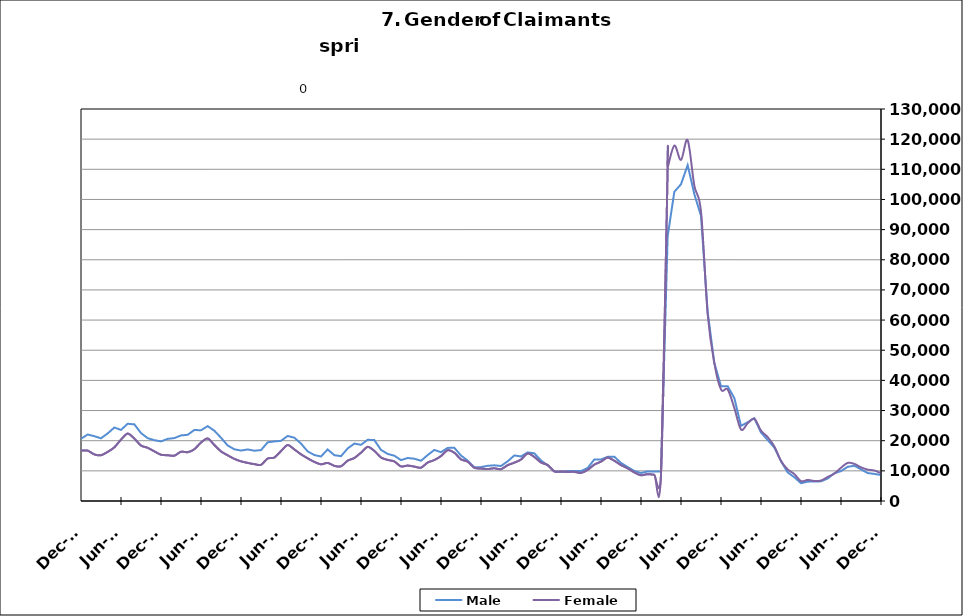
| Category | Male | Female |
|---|---|---|
| 1995-02-28 | 11910 | 7689 |
| 1995-03-31 | 12528 | 7887 |
| 1995-04-30 | 14119 | 8295 |
| 1995-05-31 | 15153 | 8659 |
| 1995-06-30 | 14654 | 9963 |
| 1995-07-31 | 16478 | 11435 |
| 1995-08-31 | 16264 | 11011 |
| 1995-09-30 | 13352 | 9104 |
| 1995-10-31 | 11499 | 8670 |
| 1995-11-30 | 10418 | 7960 |
| 1995-12-31 | 11010 | 7787 |
| 1996-01-31 | 11539 | 7863 |
| 1996-02-29 | 12768 | 7894 |
| 1996-03-31 | 13246 | 7755 |
| 1996-04-30 | 16021 | 8296 |
| 1996-05-31 | 15929 | 8751 |
| 1996-06-30 | 15291 | 10224 |
| 1996-07-31 | 17229 | 11535 |
| 1996-08-31 | 16317 | 10611 |
| 1996-09-30 | 13793 | 8812 |
| 1996-10-31 | 11431 | 8215 |
| 1996-11-30 | 10510 | 7751 |
| 1996-12-31 | 10023 | 7185 |
| 1997-01-31 | 12006 | 7404 |
| 1997-02-28 | 11976 | 7384 |
| 1997-03-31 | 11924 | 7078 |
| 1997-04-30 | 13098 | 7454 |
| 1997-05-31 | 13763 | 8032 |
| 1997-06-30 | 12872 | 9377 |
| 1997-07-31 | 15358 | 10550 |
| 1997-08-31 | 14888 | 9776 |
| 1997-09-30 | 12307 | 8016 |
| 1997-10-31 | 10749.5 | 7444 |
| 1997-11-30 | 9192 | 6872 |
| 1997-12-31 | 8541 | 6180 |
| 1998-01-31 | 9230 | 6563 |
| 1998-02-28 | 9286 | 6048 |
| 1998-03-31 | 9805 | 6012 |
| 1998-04-30 | 12254 | 7080 |
| 1998-05-31 | 13029 | 7509 |
| 1998-06-30 | 12376 | 9201 |
| 1998-07-31 | 14264 | 10448 |
| 1998-08-31 | 14319 | 9908 |
| 1998-09-30 | 12515 | 8202 |
| 1998-10-31 | 9927 | 7502 |
| 1998-11-30 | 9481 | 7563 |
| 1998-12-31 | 9422 | 7289 |
| 1999-01-31 | 10826 | 7829 |
| 1999-02-28 | 10614 | 7417 |
| 1999-03-31 | 10596 | 7180 |
| 1999-04-30 | 14139 | 8377 |
| 1999-05-31 | 14748 | 8508 |
| 1999-06-30 | 13399 | 9753 |
| 1999-07-31 | 16831 | 11294 |
| 1999-08-31 | 17466 | 10502 |
| 1999-09-30 | 14075 | 8356 |
| 1999-10-31 | 11344 | 7743 |
| 1999-11-30 | 10401 | 7623 |
| 1999-12-31 | 9702 | 6793 |
| 2000-01-31 | 10263 | 7252 |
| 2000-02-29 | 10217 | 7054 |
| 2000-03-31 | 10848 | 6860 |
| 2000-04-30 | 13099 | 8062 |
| 2000-05-31 | 13692 | 8388 |
| 2000-06-30 | 13498 | 10306 |
| 2000-07-31 | 15682 | 11874 |
| 2000-08-31 | 15407 | 10967 |
| 2000-09-30 | 12230 | 8808 |
| 2000-10-31 | 10182 | 8230 |
| 2000-11-30 | 9376 | 8049 |
| 2000-12-31 | 9229 | 7777 |
| 2001-01-31 | 10264 | 8400 |
| 2001-02-28 | 11709 | 8801 |
| 2001-03-31 | 9919 | 7036 |
| 2001-04-30 | 17255 | 11559 |
| 2001-05-31 | 18656 | 12219 |
| 2001-06-30 | 19590 | 15536 |
| 2001-07-31 | 22235 | 17388 |
| 2001-08-31 | 22550 | 16255 |
| 2001-09-30 | 20719 | 15193 |
| 2001-10-31 | 20761 | 15705 |
| 2001-11-30 | 22570 | 16084 |
| 2001-12-31 | 24429 | 16497 |
| 2002-01-31 | 26188 | 17125 |
| 2002-02-28 | 27071 | 16705 |
| 2002-03-31 | 26691 | 16475 |
| 2002-04-30 | 32125 | 20940 |
| 2002-05-31 | 31589 | 20115 |
| 2002-06-30 | 30220 | 21952 |
| 2002-07-31 | 30981 | 23132 |
| 2002-08-31 | 23858 | 16993 |
| 2002-09-30 | 27757 | 19832 |
| 2002-10-31 | 25023 | 18451 |
| 2002-11-30 | 24331 | 17763 |
| 2002-12-31 | 24361 | 17175 |
| 2003-01-31 | 24361 | 17175 |
| 2003-02-28 | 26133 | 17155 |
| 2003-03-31 | 26934 | 17491 |
| 2003-04-30 | 29393 | 19122 |
| 2003-05-31 | 30480 | 19811 |
| 2003-06-30 | 30177 | 22643 |
| 2003-07-31 | 30615 | 23565 |
| 2003-08-31 | 29860 | 22195 |
| 2003-09-30 | 26777 | 19925 |
| 2003-10-31 | 23899 | 18782 |
| 2003-11-30 | 22247 | 17944 |
| 2003-12-31 | 20902 | 16829 |
| 2004-01-31 | 20479 | 15794 |
| 2004-02-29 | 18869 | 14174 |
| 2004-03-31 | 18157 | 13452 |
| 2004-04-30 | 20525 | 14655 |
| 2004-05-31 | 20588 | 14975 |
| 2004-06-30 | 20148 | 17494 |
| 2004-07-31 | 22098 | 19064 |
| 2004-08-31 | 20778 | 16925 |
| 2004-09-30 | 17457 | 14258 |
| 2004-10-31 | 15548 | 13549 |
| 2004-11-30 | 14919 | 12836 |
| 2004-12-31 | 14200 | 11711 |
| 2005-01-31 | 14968 | 11918 |
| 2005-02-28 | 14478 | 11045 |
| 2005-03-31 | 13958 | 10426 |
| 2005-04-30 | 15898 | 11682 |
| 2005-05-31 | 16188 | 11900 |
| 2005-06-30 | 15549 | 14256 |
| 2005-07-31 | 16728 | 15274 |
| 2005-08-31 | 16418 | 13314 |
| 2005-09-30 | 12729 | 10857 |
| 2005-10-31 | 11493 | 10421 |
| 2005-11-30 | 10480 | 9638 |
| 2005-12-31 | 9482 | 8742 |
| 2006-01-31 | 9638 | 8761 |
| 2006-02-28 | 8844 | 7847 |
| 2006-03-31 | 9353 | 7709 |
| 2006-04-30 | 11916 | 9300 |
| 2006-05-31 | 12755 | 10017 |
| 2006-06-30 | 12840 | 12614 |
| 2006-07-31 | 14534 | 14007 |
| 2006-08-31 | 14510 | 12902 |
| 2006-09-30 | 12359 | 10850 |
| 2006-10-31 | 11360 | 10309 |
| 2006-11-30 | 10702 | 9403 |
| 2006-12-31 | 10886 | 9298 |
| 2007-01-31 | 11619 | 9539 |
| 2007-02-28 | 12137 | 9112 |
| 2007-03-31 | 12434 | 9125 |
| 2007-04-30 | 14864 | 10520 |
| 2007-05-31 | 16656 | 11730 |
| 2007-06-30 | 16711 | 14024 |
| 2007-07-31 | 18458 | 15882 |
| 2007-08-31 | 17879 | 14187 |
| 2007-09-30 | 16538 | 13586 |
| 2007-10-31 | 15458 | 13070 |
| 2007-11-15 | 14626 | 12172 |
| 2007-12-15 09:36:00 | 15625 | 12363 |
| 2008-01-14 19:12:00 | 17236 | 12936 |
| 2008-02-14 04:48:00 | 18262 | 12696 |
| 2008-03-15 14:24:00 | 19119 | 13263 |
| 2008-04-15 | 22039 | 15054 |
| 2008-05-15 09:36:00 | 24402 | 16733 |
| 2008-06-14 19:12:00 | 25155 | 19969 |
| 2008-07-15 04:48:00 | 27499 | 22268 |
| 2008-08-14 14:24:00 | 29286 | 21514 |
| 2008-09-14 | 30571 | 21776 |
| 2008-10-14 09:36:00 | 32282 | 22190 |
| 2008-11-13 19:12:00 | 36325 | 23395 |
| 2008-12-14 04:48:00 | 42012 | 25046 |
| 2009-01-13 14:24:00 | 49131 | 27148 |
| 2009-02-13 | 56509 | 29774 |
| 2009-03-15 09:36:00 | 63334 | 33788 |
| 2009-04-14 19:12:00 | 69062 | 36842 |
| 2009-05-15 04:48:00 | 69914 | 37773 |
| 2009-06-14 14:24:00 | 69512 | 42787 |
| 2009-07-15 | 71226 | 46347 |
| 2009-08-14 09:36:00 | 68777 | 43130 |
| 2009-09-13 19:12:00 | 65993 | 41526 |
| 2009-10-14 04:48:00 | 62480 | 40217 |
| 2009-11-13 14:24:00 | 60354 | 38454 |
| 2009-12-14 | 59507 | 36101 |
| 2010-01-13 09:36:00 | 58501 | 35014 |
| 2010-02-12 19:12:00 | 55590 | 32911 |
| 2010-03-15 04:48:00 | 53238 | 31883 |
| 2010-04-14 14:24:00 | 52264 | 32995 |
| 2010-05-15 | 50301 | 32394 |
| 2010-06-14 09:36:00 | 48130 | 36605 |
| 2010-07-14 19:12:00 | 48060 | 38748 |
| 2010-08-14 04:48:00 | 46311 | 35599 |
| 2010-09-13 14:24:00 | 41641 | 32453 |
| 2010-10-14 | 40403 | 32335 |
| 2010-11-13 09:36:00 | 38250 | 30275 |
| 2010-12-13 19:12:00 | 35858 | 26887 |
| 2011-01-13 04:48:00 | 37777 | 27522 |
| 2011-02-12 14:24:00 | 37515 | 26470 |
| 2011-03-15 | 35802 | 25248 |
| 2011-04-14 09:36:00 | 37452 | 26608 |
| 2011-05-14 19:12:00 | 37975 | 27212 |
| 2011-06-14 04:48:00 | 42289 | 36578 |
| 2011-07-14 14:24:00 | 42307 | 37061 |
| 2011-08-14 | 38125 | 31317 |
| 2011-09-13 09:36:00 | 34564 | 28090 |
| 2011-10-13 19:12:00 | 33146 | 27591 |
| 2011-11-13 04:48:00 | 31337 | 25538 |
| 2011-12-13 14:24:00 | 30334 | 23349 |
| 2012-01-13 | 31566 | 23385 |
| 2012-02-12 09:36:00 | 30859 | 22326 |
| 2012-03-13 19:12:00 | 29261 | 21568 |
| 2012-04-13 04:48:00 | 31494 | 22964 |
| 2012-05-13 14:24:00 | 32509 | 24284 |
| 2012-06-13 | 30900 | 27768 |
| 2012-07-13 09:36:00 | 33549 | 29756 |
| 2012-08-12 19:12:00 | 28663 | 24059 |
| 2012-09-12 04:48:00 | 25271 | 21482 |
| 2012-10-12 14:24:00 | 22730 | 20363 |
| 2012-11-12 | 19953 | 17450 |
| 2012-12-12 09:36:00 | 20635 | 16737 |
| 2013-01-11 19:12:00 | 22057 | 16712 |
| 2013-02-11 04:48:00 | 21486 | 15451 |
| 2013-03-13 14:24:00 | 20791 | 15186 |
| 2013-04-13 | 22409 | 16286 |
| 2013-05-13 09:36:00 | 24366 | 17794 |
| 2013-06-12 19:12:00 | 23573 | 20360 |
| 2013-07-13 04:48:00 | 25613 | 22369 |
| 2013-08-12 14:24:00 | 25420 | 20697 |
| 2013-09-12 | 22525 | 18385 |
| 2013-10-12 09:36:00 | 20848 | 17632 |
| 2013-11-11 19:12:00 | 20174 | 16466 |
| 2013-12-12 04:48:00 | 19765 | 15343 |
| 2014-01-11 14:24:00 | 20604 | 15183 |
| 2014-02-11 | 20864 | 15026 |
| 2014-03-13 09:36:00 | 21751 | 16343 |
| 2014-04-12 19:12:00 | 21948 | 16190 |
| 2014-05-13 04:48:00 | 23554 | 17163 |
| 2014-06-12 14:24:00 | 23446 | 19393 |
| 2014-07-13 | 24827 | 20751 |
| 2014-08-14 | 23315 | 18575 |
| 2014-09-13 09:36:00 | 20988 | 16453 |
| 2014-10-13 19:12:00 | 18411 | 15157 |
| 2014-11-13 04:48:00 | 17155 | 13975 |
| 2014-12-13 14:24:00 | 16727 | 13162 |
| 2015-01-13 | 17097 | 12633 |
| 2015-02-12 09:36:00 | 16674 | 12222 |
| 2015-03-14 19:12:00 | 16878 | 11988 |
| 2015-04-14 04:48:00 | 19448 | 14078 |
| 2015-05-14 14:24:00 | 19759 | 14413 |
| 2015-06-14 | 19952 | 16548 |
| 2015-07-14 09:36:00 | 21569 | 18572 |
| 2015-08-13 19:12:00 | 21001 | 17106 |
| 2015-09-13 04:48:00 | 19028 | 15475 |
| 2015-10-13 14:24:00 | 16459 | 14160 |
| 2015-11-13 | 15246 | 12968 |
| 2015-12-13 09:36:00 | 14756 | 12166 |
| 2016-01-12 19:12:00 | 17097 | 12633 |
| 2016-02-12 04:48:00 | 15198 | 11659 |
| 2016-03-13 14:24:00 | 14862 | 11506 |
| 2016-04-13 | 17432 | 13364 |
| 2016-05-13 09:36:00 | 19040 | 14264 |
| 2016-06-12 19:12:00 | 18628 | 16024 |
| 2016-07-13 04:48:00 | 20305 | 17959 |
| 2016-08-12 14:24:00 | 20204 | 16625 |
| 2016-09-12 | 16946 | 14443 |
| 2016-10-12 09:36:00 | 15612 | 13624 |
| 2016-11-11 19:12:00 | 15023 | 13122 |
| 2016-12-12 04:48:00 | 13560 | 11454 |
| 2017-01-11 14:24:00 | 14257 | 11754 |
| 2017-02-11 | 14028 | 11405 |
| 2017-03-13 09:36:00 | 13342 | 11038 |
| 2017-04-12 19:12:00 | 15225 | 12749 |
| 2017-05-13 04:48:00 | 16938 | 13582 |
| 2017-06-12 14:24:00 | 16188 | 14911 |
| 2017-07-13 | 17613 | 16845 |
| 2017-08-12 09:36:00 | 17640 | 16005 |
| 2017-09-11 19:12:00 | 15075 | 13806 |
| 2017-10-12 04:48:00 | 13384 | 13044 |
| 2017-11-11 14:24:00 | 11160 | 11015 |
| 2017-12-12 | 11238 | 10767 |
| 2018-01-11 09:36:00 | 11674 | 10594 |
| 2018-02-10 19:12:00 | 11835 | 10845 |
| 2018-03-13 04:48:00 | 11605 | 10548 |
| 2018-04-12 14:24:00 | 13162 | 11886 |
| 2018-05-13 | 15110 | 12712 |
| 2018-06-12 09:36:00 | 14782 | 13754 |
| 2018-07-12 19:12:00 | 16123 | 15773 |
| 2018-08-12 04:48:00 | 15808 | 14614 |
| 2018-09-11 14:24:00 | 13450 | 12761 |
| 2018-10-12 | 11831 | 11941 |
| 2018-11-11 09:36:00 | 9820 | 9821 |
| 2018-12-11 19:12:00 | 9649 | 9767 |
| 2019-01-11 04:48:00 | 9933 | 9654 |
| 2019-02-10 14:24:00 | 9925 | 9651 |
| 2019-03-13 | 9922 | 9318 |
| 2019-04-12 09:36:00 | 10950 | 10320 |
| 2019-05-12 19:12:00 | 13782 | 12072 |
| 2019-06-12 04:48:00 | 13767 | 13063 |
| 2019-07-12 14:24:00 | 14644 | 14409 |
| 2019-08-12 | 14678 | 13343 |
| 2019-09-11 09:36:00 | 12637 | 11915 |
| 2019-10-11 19:12:00 | 11254 | 10847 |
| 2019-11-11 04:48:00 | 9954 | 9467 |
| 2019-12-11 14:24:00 | 9289 | 8549 |
| 2020-01-11 | 9815 | 8911 |
| 2020-02-10 09:36:00 | 9754 | 8723 |
| 2020-03-11 19:12:00 | 9805 | 8802 |
| 2020-04-11 04:48:00 | 87837 | 110534 |
| 2020-05-11 14:24:00 | 102538 | 117856 |
| 2020-06-11 | 105039 | 113108 |
| 2020-07-11 09:36:00 | 111386 | 119644 |
| 2020-08-10 19:12:00 | 101758 | 104593 |
| 2020-09-10 04:48:00 | 94558 | 95979 |
| 2020-10-10 14:24:00 | 62680 | 62005 |
| 2020-11-10 | 45770 | 45707 |
| 2020-12-10 09:36:00 | 38071 | 36983 |
| 2021-01-09 19:12:00 | 38071 | 36983 |
| 2021-02-09 04:48:00 | 34126 | 30845 |
| 2021-03-11 14:24:00 | 24924 | 23717 |
| 2021-04-11 | 26116 | 25767 |
| 2021-05-11 09:36:00 | 27432 | 27279 |
| 2021-06-10 19:12:00 | 22711 | 23336 |
| 2021-07-11 04:48:00 | 20218 | 21201 |
| 2021-08-10 14:24:00 | 17708 | 18105 |
| 2021-09-10 | 13157 | 13319 |
| 2021-10-10 09:36:00 | 9494 | 10478 |
| 2021-11-09 19:12:00 | 7871 | 8942 |
| 2021-12-10 04:48:00 | 5889 | 6585 |
| 2022-01-09 14:24:00 | 6421 | 6988 |
| 2022-02-09 | 6439 | 6634 |
| 2022-03-11 09:36:00 | 6526 | 6780 |
| 2022-04-10 19:12:00 | 7456 | 7968 |
| 2022-05-11 04:48:00 | 9208 | 9103 |
| 2022-06-10 14:24:00 | 9908 | 11010 |
| 2022-07-11 | 11333 | 12637 |
| 2022-08-10 09:36:00 | 11684 | 12302 |
| 2022-09-09 19:12:00 | 10505 | 11164 |
| 2022-10-10 04:48:00 | 9269 | 10405 |
| 2022-11-09 14:24:00 | 8987 | 10105 |
| 2022-12-10 | 8606 | 9206 |